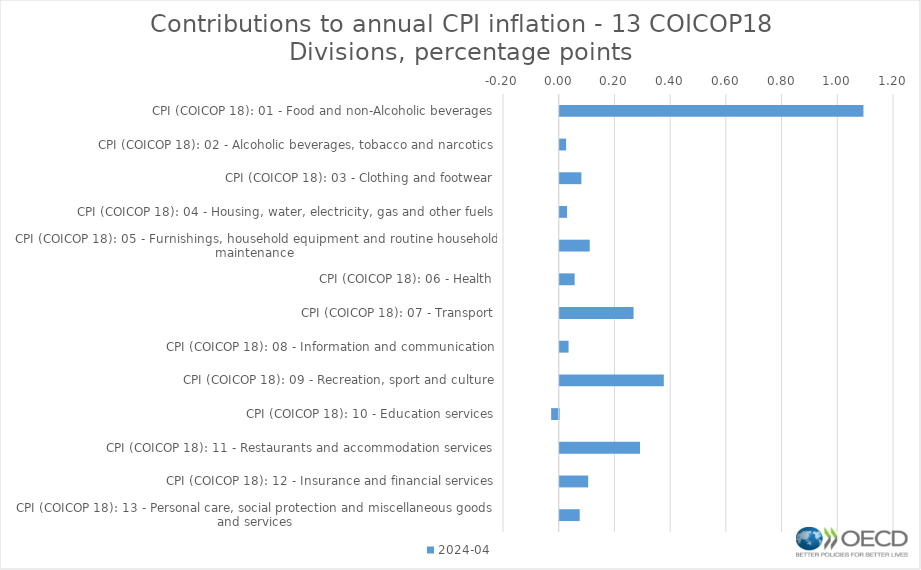
| Category | 2024-04 |
|---|---|
| CPI (COICOP 18): 01 - Food and non-Alcoholic beverages | 1.09 |
| CPI (COICOP 18): 02 - Alcoholic beverages, tobacco and narcotics | 0.023 |
| CPI (COICOP 18): 03 - Clothing and footwear | 0.078 |
| CPI (COICOP 18): 04 - Housing, water, electricity, gas and other fuels | 0.026 |
| CPI (COICOP 18): 05 - Furnishings, household equipment and routine household maintenance | 0.108 |
| CPI (COICOP 18): 06 - Health | 0.054 |
| CPI (COICOP 18): 07 - Transport | 0.265 |
| CPI (COICOP 18): 08 - Information and communication | 0.032 |
| CPI (COICOP 18): 09 - Recreation, sport and culture | 0.374 |
| CPI (COICOP 18): 10 - Education services | -0.027 |
| CPI (COICOP 18): 11 - Restaurants and accommodation services | 0.288 |
| CPI (COICOP 18): 12 - Insurance and financial services | 0.102 |
| CPI (COICOP 18): 13 - Personal care, social protection and miscellaneous goods and services | 0.072 |